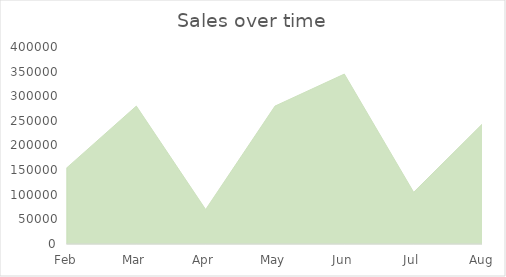
| Category | Total |
|---|---|
| Feb | 155000 |
| Mar | 280000 |
| Apr | 70000 |
| May | 280000 |
| Jun | 345000 |
| Jul | 105000 |
| Aug | 245000 |